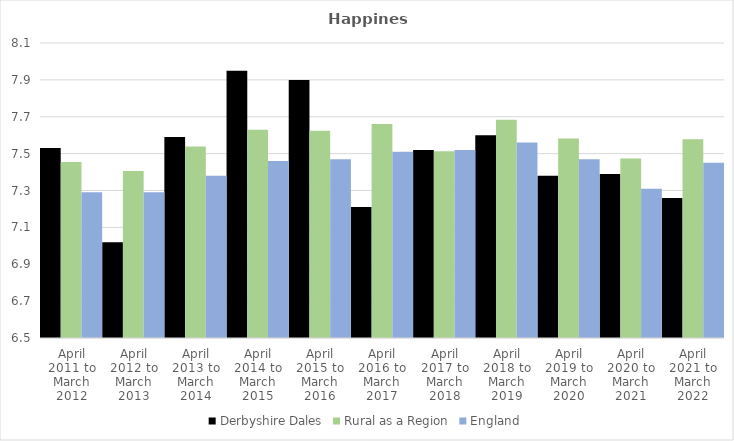
| Category | Derbyshire Dales | Rural as a Region | England |
|---|---|---|---|
| April 2011 to March 2012 | 7.53 | 7.454 | 7.29 |
| April 2012 to March 2013 | 7.02 | 7.406 | 7.29 |
| April 2013 to March 2014 | 7.59 | 7.539 | 7.38 |
| April 2014 to March 2015 | 7.95 | 7.63 | 7.46 |
| April 2015 to March 2016 | 7.9 | 7.625 | 7.47 |
| April 2016 to March 2017 | 7.21 | 7.661 | 7.51 |
| April 2017 to March 2018 | 7.52 | 7.513 | 7.52 |
| April 2018 to March 2019 | 7.6 | 7.684 | 7.56 |
| April 2019 to March 2020 | 7.38 | 7.582 | 7.47 |
| April 2020 to March 2021 | 7.39 | 7.474 | 7.31 |
| April 2021 to March 2022 | 7.26 | 7.577 | 7.45 |